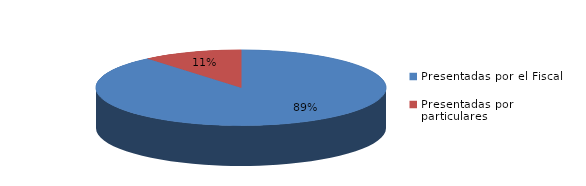
| Category | Series 0 |
|---|---|
| Presentadas por el Fiscal | 56 |
| Presentadas por particulares | 7 |